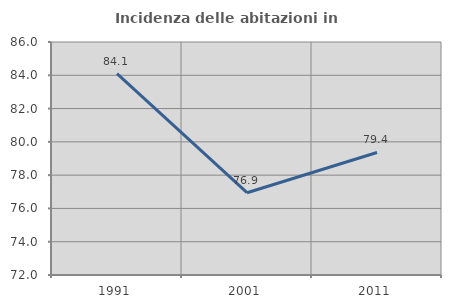
| Category | Incidenza delle abitazioni in proprietà  |
|---|---|
| 1991.0 | 84.1 |
| 2001.0 | 76.945 |
| 2011.0 | 79.361 |